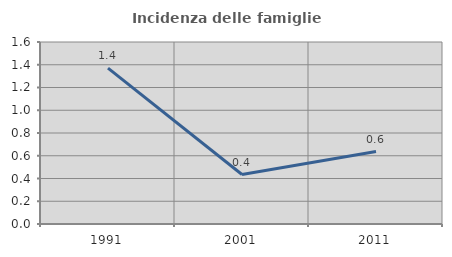
| Category | Incidenza delle famiglie numerose |
|---|---|
| 1991.0 | 1.37 |
| 2001.0 | 0.435 |
| 2011.0 | 0.637 |